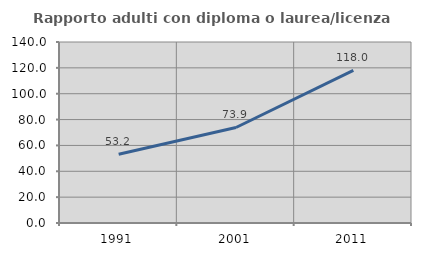
| Category | Rapporto adulti con diploma o laurea/licenza media  |
|---|---|
| 1991.0 | 53.176 |
| 2001.0 | 73.872 |
| 2011.0 | 118.037 |